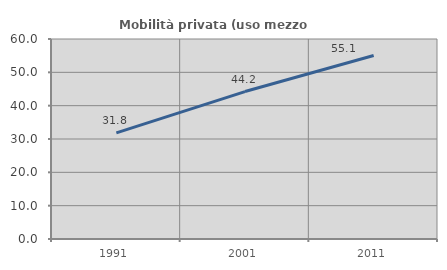
| Category | Mobilità privata (uso mezzo privato) |
|---|---|
| 1991.0 | 31.844 |
| 2001.0 | 44.23 |
| 2011.0 | 55.055 |